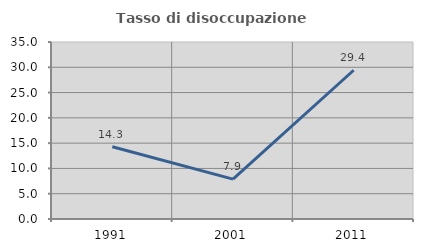
| Category | Tasso di disoccupazione giovanile  |
|---|---|
| 1991.0 | 14.286 |
| 2001.0 | 7.895 |
| 2011.0 | 29.412 |